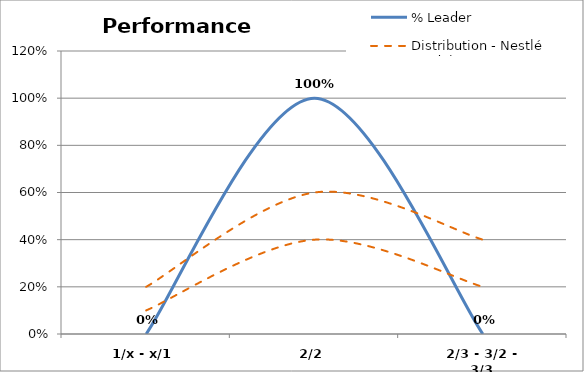
| Category | % Leader | Distribution - Nestlé Guideline |
|---|---|---|
| 1/x - x/1 | 0 | 0.2 |
| 2/2 | 1 | 0.6 |
| 2/3 - 3/2 - 3/3 | 0 | 0.4 |